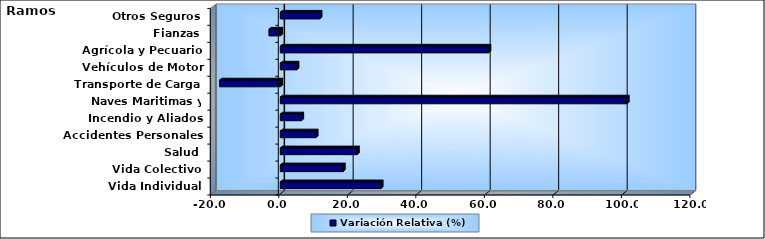
| Category | Variación Relativa (%) |
|---|---|
| Vida Individual | 29.342 |
| Vida Colectivo | 18.287 |
| Salud | 22.395 |
| Accidentes Personales | 10.357 |
| Incendio y Aliados | 6.149 |
| Naves Maritimas y Aéreas | 101.165 |
| Transporte de Carga | -17.725 |
| Vehículos de Motor | 4.765 |
| Agrícola y Pecuario | 60.792 |
| Fianzas | -3.315 |
| Otros Seguros | 11.493 |